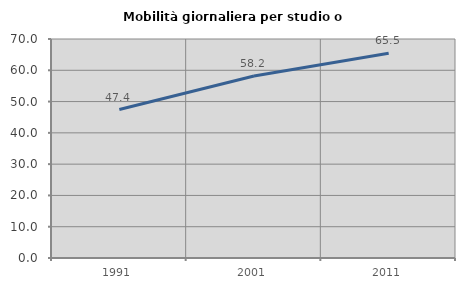
| Category | Mobilità giornaliera per studio o lavoro |
|---|---|
| 1991.0 | 47.447 |
| 2001.0 | 58.197 |
| 2011.0 | 65.464 |